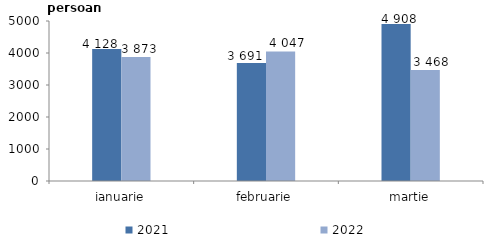
| Category | 2021 | 2022 |
|---|---|---|
| ianuarie | 4128 | 3873 |
| februarie | 3691 | 4047 |
| martie | 4908 | 3468 |